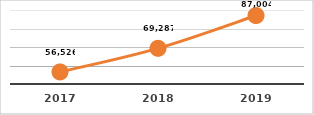
| Category | CERTIFICACIÓN DE COMPETENCIAS (%) |
|---|---|
| 2017.0 | 56526 |
| 2018.0 | 69287 |
| 2019.0 | 87004 |